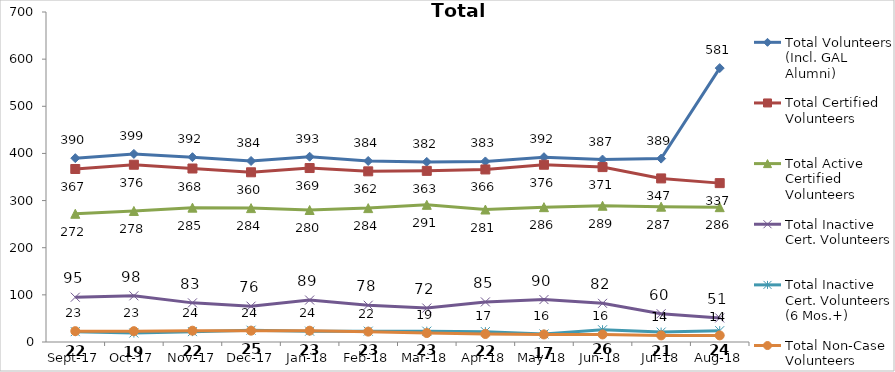
| Category | Total Volunteers (Incl. GAL Alumni) | Total Certified Volunteers | Total Active Certified Volunteers | Total Inactive Cert. Volunteers | Total Inactive Cert. Volunteers (6 Mos.+) | Total Non-Case Volunteers |
|---|---|---|---|---|---|---|
| 2017-09-01 | 390 | 367 | 272 | 95 | 22 | 23 |
| 2017-10-01 | 399 | 376 | 278 | 98 | 19 | 23 |
| 2017-11-01 | 392 | 368 | 285 | 83 | 22 | 24 |
| 2017-12-01 | 384 | 360 | 284 | 76 | 25 | 24 |
| 2018-01-01 | 393 | 369 | 280 | 89 | 23 | 24 |
| 2018-02-01 | 384 | 362 | 284 | 78 | 23 | 22 |
| 2018-03-01 | 382 | 363 | 291 | 72 | 23 | 19 |
| 2018-04-01 | 383 | 366 | 281 | 85 | 22 | 17 |
| 2018-05-01 | 392 | 376 | 286 | 90 | 17 | 16 |
| 2018-06-01 | 387 | 371 | 289 | 82 | 26 | 16 |
| 2018-07-01 | 389 | 347 | 287 | 60 | 21 | 14 |
| 2018-08-01 | 581 | 337 | 286 | 51 | 24 | 14 |